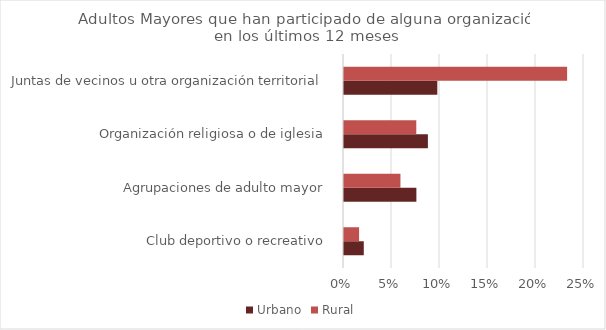
| Category | Urbano | Rural |
|---|---|---|
| Club deportivo o recreativo | 0.021 | 0.016 |
| Agrupaciones de adulto mayor | 0.075 | 0.059 |
| Organización religiosa o de iglesia | 0.087 | 0.075 |
| Juntas de vecinos u otra organización territorial | 0.097 | 0.232 |